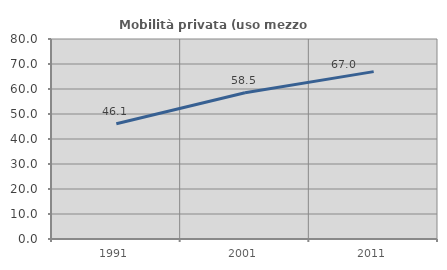
| Category | Mobilità privata (uso mezzo privato) |
|---|---|
| 1991.0 | 46.101 |
| 2001.0 | 58.478 |
| 2011.0 | 66.952 |